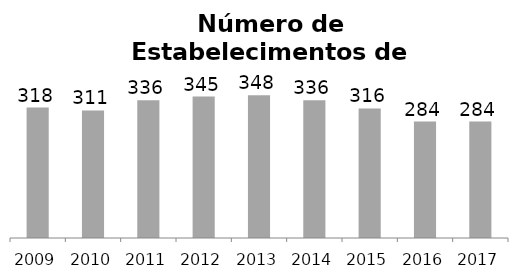
| Category | Transporte Terrestre |
|---|---|
| 2009.0 | 318 |
| 2010.0 | 311 |
| 2011.0 | 336 |
| 2012.0 | 345 |
| 2013.0 | 348 |
| 2014.0 | 336 |
| 2015.0 | 316 |
| 2016.0 | 284 |
| 2017.0 | 284 |